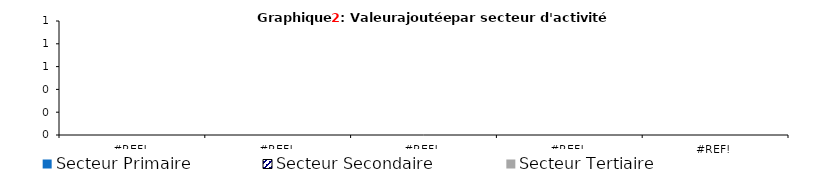
| Category | Secteur Primaire | Secteur Secondaire | Secteur Tertiaire |
|---|---|---|---|
| 0.0 | 0 | 0 | 0 |
| 0.0 | 0 | 0 | 0 |
| 0.0 | 0 | 0 | 0 |
| 0.0 | 0 | 0 | 0 |
| 0.0 | 0 | 0 | 0 |